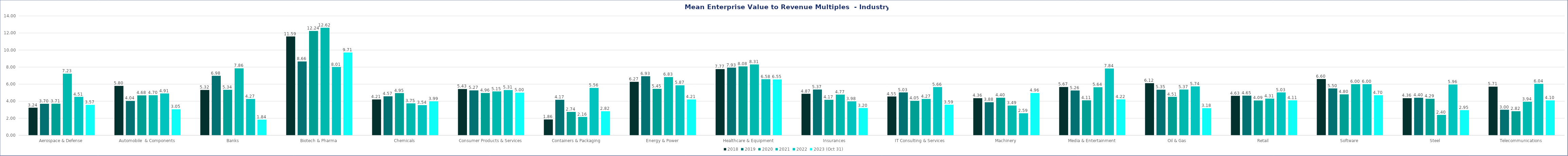
| Category | 2018 | 2019 | 2020 | 2021 | 2022 | 2023 (Oct 31) |
|---|---|---|---|---|---|---|
| Aerospace & Defense | 3.24 | 3.7 | 3.71 | 7.23 | 4.51 | 3.57 |
| Automobile  & Components | 5.8 | 4.04 | 4.68 | 4.7 | 4.91 | 3.05 |
| Banks | 5.32 | 6.98 | 5.34 | 7.86 | 4.27 | 1.84 |
| Biotech & Pharma | 11.59 | 8.66 | 12.24 | 12.62 | 8.01 | 9.71 |
| Chemicals | 4.21 | 4.57 | 4.95 | 3.75 | 3.54 | 3.99 |
| Consumer Products & Services | 5.43 | 5.27 | 4.96 | 5.15 | 5.31 | 5 |
| Containers & Packaging | 1.86 | 4.17 | 2.74 | 2.16 | 5.56 | 2.82 |
| Energy & Power | 6.27 | 6.93 | 5.45 | 6.83 | 5.87 | 4.21 |
| Healthcare & Equipment | 7.77 | 7.93 | 8.08 | 8.31 | 6.58 | 6.55 |
| Insurances | 4.87 | 5.37 | 4.17 | 4.77 | 3.98 | 3.2 |
| IT Consulting & Services | 4.55 | 5.03 | 4.05 | 4.27 | 5.66 | 3.59 |
| Machinery | 4.36 | 3.88 | 4.4 | 3.49 | 2.59 | 4.96 |
| Media & Entertainment | 5.67 | 5.26 | 4.11 | 5.64 | 7.84 | 4.22 |
| Oil & Gas | 6.12 | 5.35 | 4.51 | 5.37 | 5.74 | 3.18 |
| Retail | 4.63 | 4.65 | 4.09 | 4.31 | 5.03 | 4.11 |
| Software | 6.6 | 5.5 | 4.8 | 6 | 6 | 4.7 |
| Steel | 4.36 | 4.4 | 4.29 | 2.4 | 5.96 | 2.95 |
| Telecommunications | 5.71 | 3 | 2.82 | 3.94 | 6.04 | 4.1 |